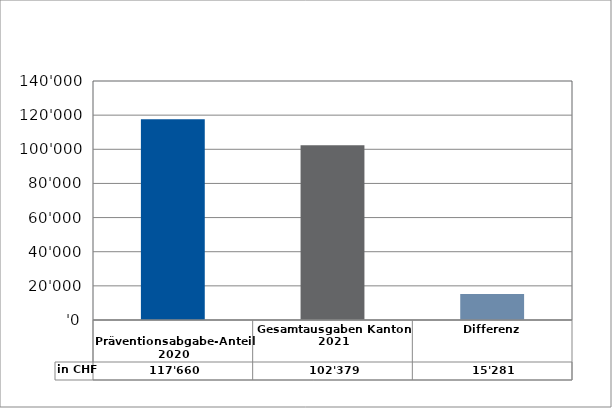
| Category | in CHF |
|---|---|
| 
Präventionsabgabe-Anteil 2020

 | 117660.05 |
| Gesamtausgaben Kanton 2021
 | 102379.45 |
| Differenz | 15280.6 |